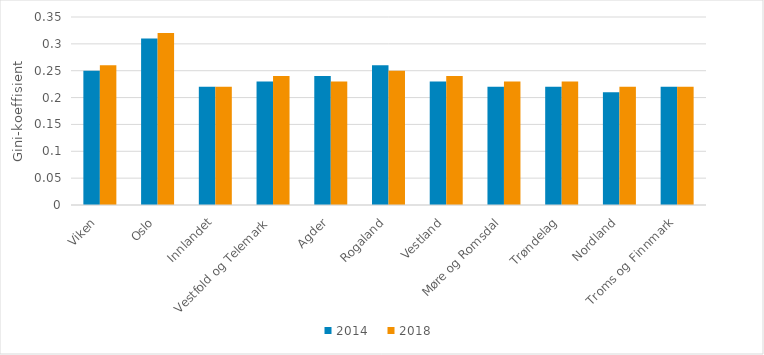
| Category | 2014 | 2018 |
|---|---|---|
| Viken | 0.25 | 0.26 |
| Oslo | 0.31 | 0.32 |
| Innlandet | 0.22 | 0.22 |
| Vestfold og Telemark | 0.23 | 0.24 |
| Agder | 0.24 | 0.23 |
| Rogaland | 0.26 | 0.25 |
| Vestland | 0.23 | 0.24 |
| Møre og Romsdal | 0.22 | 0.23 |
| Trøndelag | 0.22 | 0.23 |
| Nordland | 0.21 | 0.22 |
| Troms og Finnmark | 0.22 | 0.22 |